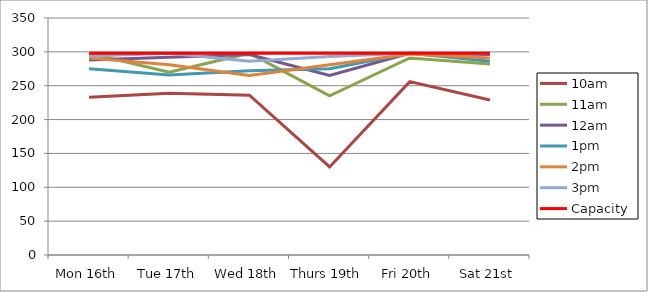
| Category | 9am | 10am | 11am | 12am | 1pm | 2pm | 3pm | 4pm | 5pm | Capacity |
|---|---|---|---|---|---|---|---|---|---|---|
| Mon 16th |  | 233 | 298 | 288 | 275 | 291 | 294 |  |  | 298 |
| Tue 17th |  | 239 | 270 | 292 | 266 | 281 | 298 |  |  | 298 |
| Wed 18th |  | 236 | 298 | 296 | 272 | 265 | 286 |  |  | 298 |
| Thurs 19th |  | 130 | 235 | 265 | 275 | 281 | 293 |  |  | 298 |
| Fri 20th |  | 256 | 291 | 298 | 298 | 297 | 298 |  |  | 298 |
| Sat 21st |  | 229 | 282 | 296 | 286 | 291 | 298 |  |  | 298 |